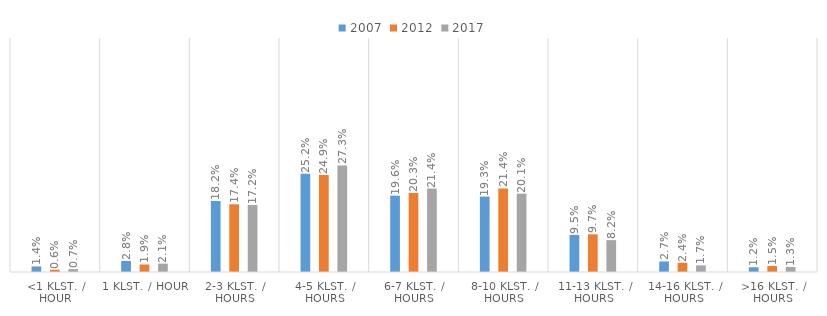
| Category | 2007 | 2012 | 2017 |
|---|---|---|---|
| <1 klst. / hour | 0.014 | 0.006 | 0.007 |
| 1 klst. / hour | 0.028 | 0.019 | 0.021 |
| 2-3 klst. / hours | 0.182 | 0.174 | 0.172 |
| 4-5 klst. / hours | 0.252 | 0.249 | 0.273 |
| 6-7 klst. / hours | 0.196 | 0.203 | 0.214 |
| 8-10 klst. / hours | 0.193 | 0.214 | 0.201 |
| 11-13 klst. / hours | 0.095 | 0.097 | 0.082 |
| 14-16 klst. / hours | 0.027 | 0.024 | 0.017 |
| >16 klst. / hours | 0.012 | 0.015 | 0.013 |